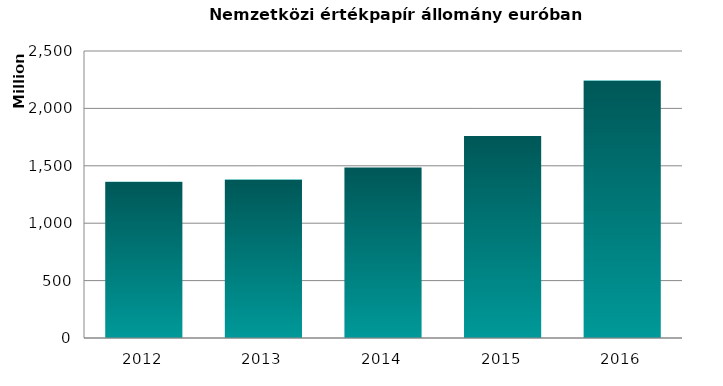
| Category | Állományi adatok (EUR) |
|---|---|
| 2012.0 | 1362122724 |
| 2013.0 | 1379705020 |
| 2014.0 | 1485763279 |
| 2015.0 | 1759041703 |
| 2016.0 | 2243055213 |